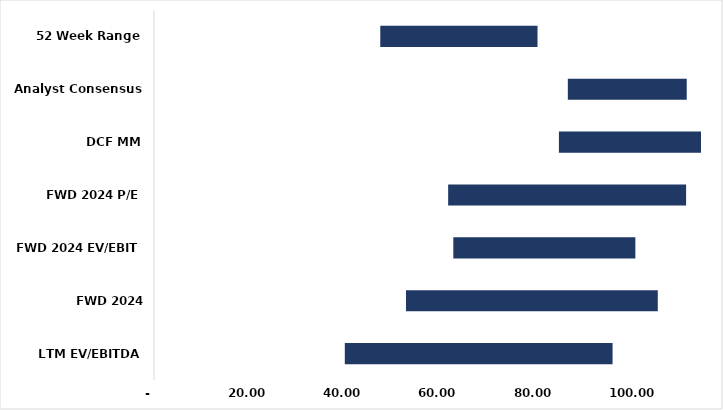
| Category | Series 0 | Series 1 | Series 2 |
|---|---|---|---|
| LTM EV/EBITDA | 40.112 | 56.297 | 96.41 |
| FWD 2024 EV/EBITDA | 52.976 | 52.939 | 105.915 |
| FWD 2024 EV/EBIT | 62.925 | 38.275 | 101.199 |
| FWD 2024 P/E | 61.841 | 50.027 | 111.869 |
| DCF MM | 85.127 | 34.078 | 119.205 |
| Analyst Consensus | 87 | 25 | 112 |
| 52 Week Range | 47.57 | 33.06 | 80.63 |